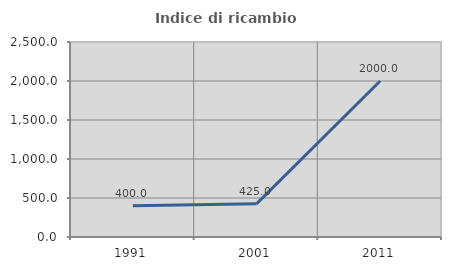
| Category | Indice di ricambio occupazionale  |
|---|---|
| 1991.0 | 400 |
| 2001.0 | 425 |
| 2011.0 | 2000 |